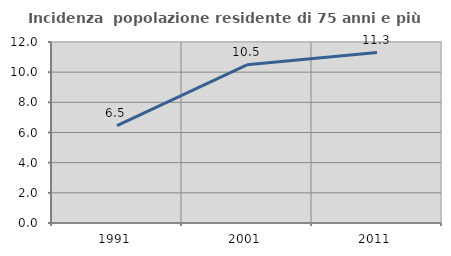
| Category | Incidenza  popolazione residente di 75 anni e più |
|---|---|
| 1991.0 | 6.452 |
| 2001.0 | 10.484 |
| 2011.0 | 11.301 |